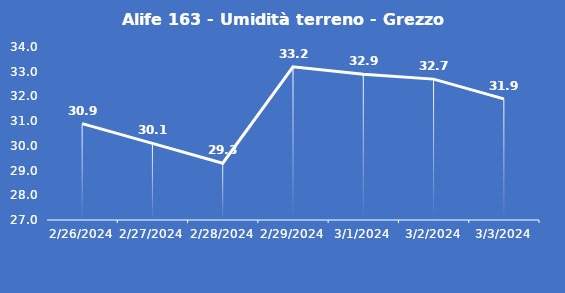
| Category | Alife 163 - Umidità terreno - Grezzo (%VWC) |
|---|---|
| 2/26/24 | 30.9 |
| 2/27/24 | 30.1 |
| 2/28/24 | 29.3 |
| 2/29/24 | 33.2 |
| 3/1/24 | 32.9 |
| 3/2/24 | 32.7 |
| 3/3/24 | 31.9 |